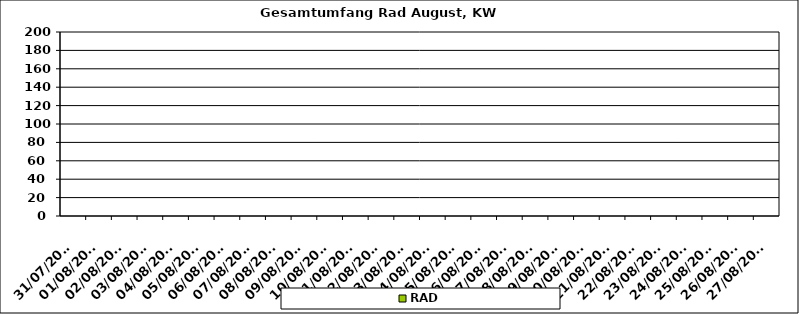
| Category | RAD |
|---|---|
| 31/07/2023 | 0 |
| 01/08/2023 | 0 |
| 02/08/2023 | 0 |
| 03/08/2023 | 0 |
| 04/08/2023 | 0 |
| 05/08/2023 | 0 |
| 06/08/2023 | 0 |
| 07/08/2023 | 0 |
| 08/08/2023 | 0 |
| 09/08/2023 | 0 |
| 10/08/2023 | 0 |
| 11/08/2023 | 0 |
| 12/08/2023 | 0 |
| 13/08/2023 | 0 |
| 14/08/2023 | 0 |
| 15/08/2023 | 0 |
| 16/08/2023 | 0 |
| 17/08/2023 | 0 |
| 18/08/2023 | 0 |
| 19/08/2023 | 0 |
| 20/08/2023 | 0 |
| 21/08/2023 | 0 |
| 22/08/2023 | 0 |
| 23/08/2023 | 0 |
| 24/08/2023 | 0 |
| 25/08/2023 | 0 |
| 26/08/2023 | 0 |
| 27/08/2023 | 0 |